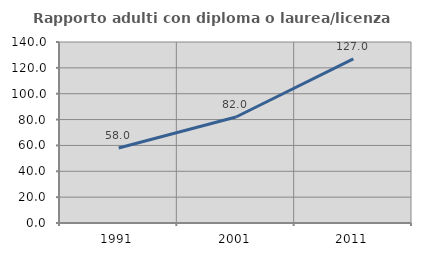
| Category | Rapporto adulti con diploma o laurea/licenza media  |
|---|---|
| 1991.0 | 58.033 |
| 2001.0 | 81.994 |
| 2011.0 | 126.96 |